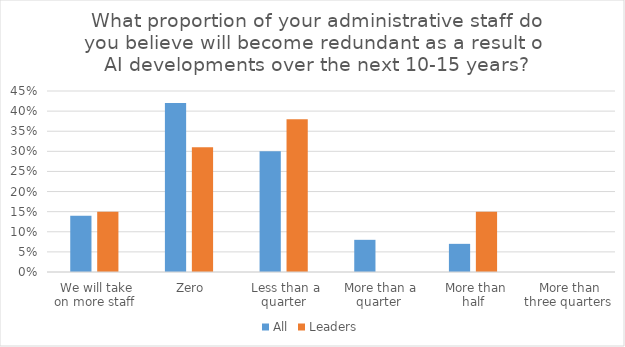
| Category | All | Leaders |
|---|---|---|
|  We will take on more staff | 0.14 | 0.15 |
|  Zero | 0.42 | 0.31 |
|  Less than a quarter | 0.3 | 0.38 |
|  More than a quarter | 0.08 | 0 |
|  More than half | 0.07 | 0.15 |
|  More than three quarters | 0 | 0 |